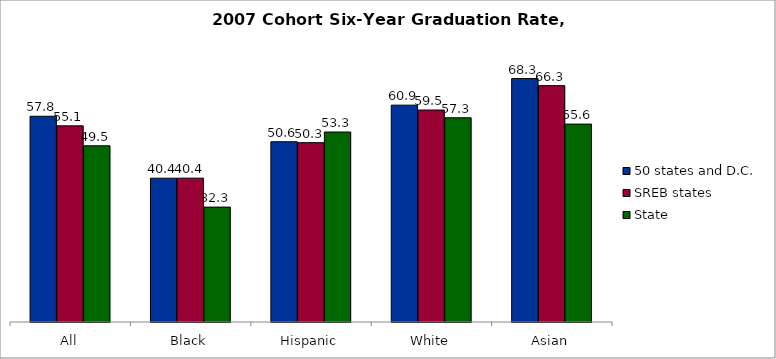
| Category | 50 states and D.C. | SREB states | State |
|---|---|---|---|
| All | 57.757 | 55.063 | 49.463 |
| Black | 40.366 | 40.381 | 32.254 |
| Hispanic | 50.597 | 50.334 | 53.333 |
| White | 60.872 | 59.497 | 57.326 |
| Asian | 68.335 | 66.349 | 55.556 |